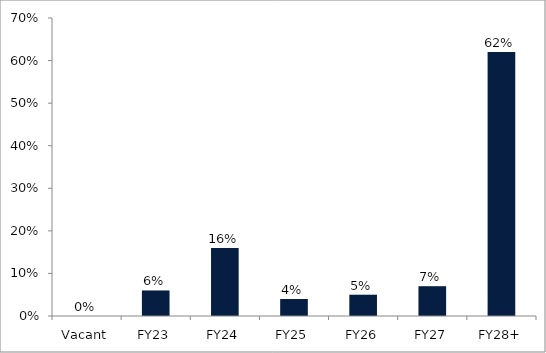
| Category | Series 0 |
|---|---|
| Vacant | 0 |
| FY23 | 0.06 |
| FY24 | 0.16 |
| FY25 | 0.04 |
| FY26 | 0.05 |
| FY27 | 0.07 |
| FY28+ | 0.62 |